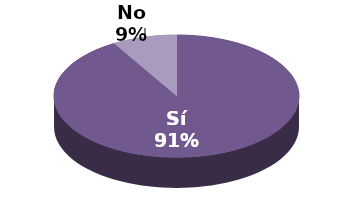
| Category | Series 1 |
|---|---|
| Sí | 43 |
| No | 4 |